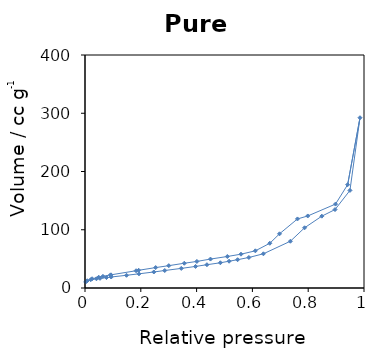
| Category | Series 0 |
|---|---|
| 0.002622 | 10.342 |
| 0.008127 | 12.441 |
| 0.020581 | 14.236 |
| 0.041073 | 15.828 |
| 0.053866 | 16.63 |
| 0.076944 | 17.906 |
| 0.093861 | 18.877 |
| 0.148731 | 21.818 |
| 0.193402 | 24.34 |
| 0.246726 | 27.496 |
| 0.285838 | 30.035 |
| 0.345116 | 33.66 |
| 0.396247 | 37.006 |
| 0.437077 | 39.981 |
| 0.485146 | 43.313 |
| 0.516383 | 45.951 |
| 0.546914 | 48.597 |
| 0.587363 | 52.408 |
| 0.639431 | 58.694 |
| 0.736157 | 80.264 |
| 0.787051 | 103.375 |
| 0.848804 | 123.315 |
| 0.896192 | 134.665 |
| 0.949646 | 167.533 |
| 0.985652 | 292.284 |
| 0.941416 | 177.387 |
| 0.897866 | 144.056 |
| 0.798496 | 123.669 |
| 0.761543 | 118.565 |
| 0.697298 | 93.038 |
| 0.662448 | 76.793 |
| 0.610544 | 63.798 |
| 0.559047 | 58.044 |
| 0.510222 | 54.08 |
| 0.449685 | 49.656 |
| 0.401009 | 45.612 |
| 0.355828 | 42.511 |
| 0.300321 | 38.354 |
| 0.253275 | 35.051 |
| 0.192427 | 30.434 |
| 0.183001 | 29.615 |
| 0.093147 | 22.592 |
| 0.091517 | 22.386 |
| 0.064224 | 20.013 |
| 0.049185 | 18.502 |
| 0.025392 | 15.836 |